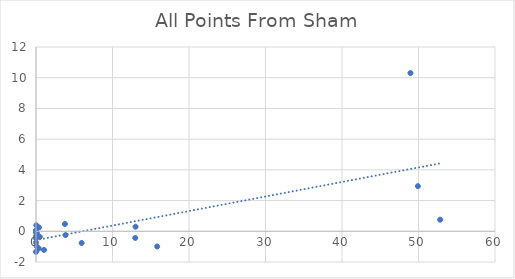
| Category | All Points From Sham |
|---|---|
| 48.95 | 10.302 |
| 13.01 | 0.296 |
| 3.78 | 0.473 |
| 0.39 | 0.249 |
| 0.1 | -0.208 |
| 0.04 | 0.39 |
| 0.0 | 0.063 |
| 0.0 | -0.455 |
| 52.83 | 0.754 |
| 12.97 | -0.433 |
| 3.86 | -0.248 |
| 0.5 | -0.363 |
| 0.11 | -0.127 |
| 0.05 | -0.033 |
| 0.0 | -0.082 |
| 0.0 | -0.33 |
| 49.92 | 2.939 |
| 15.84 | -0.992 |
| 5.97 | -0.763 |
| 1.05 | -1.214 |
| 0.36 | -1.12 |
| 0.1 | -0.99 |
| 0.0 | -0.725 |
| 0.0 | -1.34 |